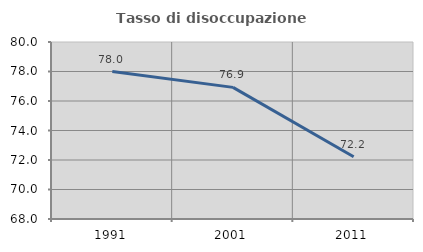
| Category | Tasso di disoccupazione giovanile  |
|---|---|
| 1991.0 | 78 |
| 2001.0 | 76.923 |
| 2011.0 | 72.222 |